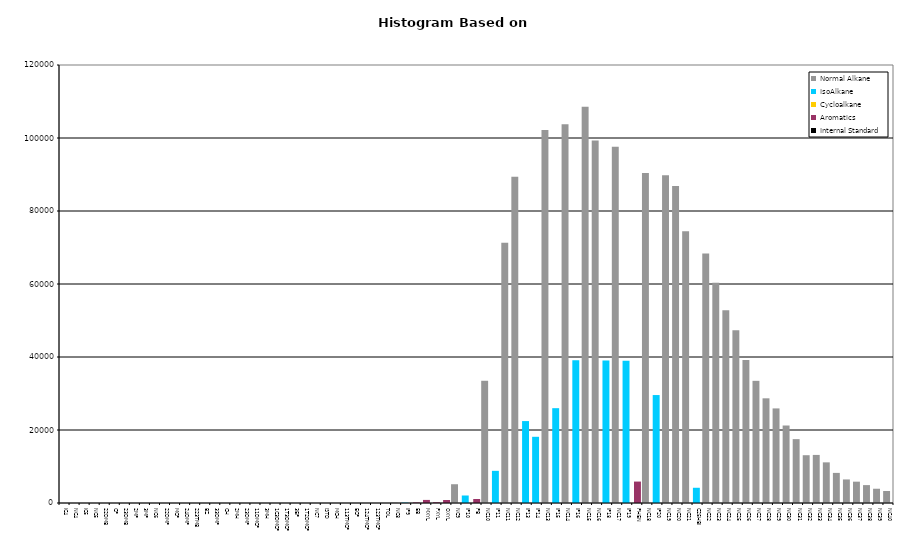
| Category | Normal Alkane | IsoAlkane | Cycloalkane | Aromatics | Internal Standard |
|---|---|---|---|---|---|
| IC4 | 0 | 0 | 0 | 0 | 0 |
| NC4 | 0 | 0 | 0 | 0 | 0 |
| IC5 | 0 | 0 | 0 | 0 | 0 |
| NC5 | 0 | 0 | 0 | 0 | 0 |
| 22DMB | 0 | 0 | 0 | 0 | 0 |
| CP | 0 | 0 | 0 | 0 | 0 |
| 23DMB | 0 | 0 | 0 | 0 | 0 |
| 2MP | 0 | 0 | 0 | 0 | 0 |
| 3MP | 0 | 0 | 0 | 0 | 0 |
| NC6 | 0 | 0 | 0 | 0 | 0 |
| 22DMP | 0 | 0 | 0 | 0 | 0 |
| MCP | 0 | 0 | 0 | 0 | 0 |
| 24DMP | 0 | 0 | 0 | 0 | 0 |
| 223TMB | 0 | 0 | 0 | 0 | 0 |
| BZ | 0 | 0 | 0 | 0 | 0 |
| 33DMP | 0 | 0 | 0 | 0 | 0 |
| CH | 0 | 0 | 0 | 0 | 0 |
| 2MH | 0 | 0 | 0 | 0 | 0 |
| 23DMP | 0 | 0 | 0 | 0 | 0 |
| 11DMCP | 0 | 0 | 0 | 0 | 0 |
| 3MH | 0 | 0 | 0 | 0 | 0 |
| 1C3DMCP | 0 | 0 | 0 | 0 | 0 |
| 1T3DMCP | 0 | 0 | 0 | 0 | 0 |
| 3EP | 0 | 0 | 0 | 0 | 0 |
| 1T2DMCP | 0 | 0 | 0 | 0 | 0 |
| NC7 | 0 | 0 | 0 | 0 | 0 |
| ISTD | 0 | 0 | 0 | 0 | 0 |
| MCH | 0 | 0 | 0 | 0 | 0 |
| 113TMCP | 0 | 0 | 0 | 0 | 0 |
| ECP | 0 | 0 | 0 | 0 | 0 |
| 124TMCP | 0 | 0 | 0 | 0 | 0 |
| 123TMCP | 0 | 0 | 0 | 0 | 0 |
| TOL | 0 | 0 | 0 | 0 | 0 |
| NC8 | 88 | 0 | 0 | 0 | 0 |
| IP9 | 0 | 107 | 0 | 0 | 0 |
| EB | 0 | 0 | 0 | 159 | 0 |
| MXYL | 0 | 0 | 0 | 844 | 0 |
| PXYL | 0 | 0 | 0 | 206 | 0 |
| OXYL | 0 | 0 | 0 | 819 | 0 |
| NC9 | 5143 | 0 | 0 | 0 | 0 |
| IP10 | 0 | 2055 | 0 | 0 | 0 |
| PB | 0 | 0 | 0 | 1101 | 0 |
| NC10 | 33487 | 0 | 0 | 0 | 0 |
| IP11 | 0 | 8812 | 0 | 0 | 0 |
| NC11 | 71302 | 0 | 0 | 0 | 0 |
| NC12 | 89387 | 0 | 0 | 0 | 0 |
| IP13 | 0 | 22445 | 0 | 0 | 0 |
| IP14 | 0 | 18138 | 0 | 0 | 0 |
| NC13 | 102183 | 0 | 0 | 0 | 0 |
| IP15 | 0 | 25978 | 0 | 0 | 0 |
| NC14 | 103780 | 0 | 0 | 0 | 0 |
| IP16 | 0 | 39123 | 0 | 0 | 0 |
| NC15 | 108555 | 0 | 0 | 0 | 0 |
| NC16 | 99295 | 0 | 0 | 0 | 0 |
| IP18 | 0 | 39028 | 0 | 0 | 0 |
| NC17 | 97632 | 0 | 0 | 0 | 0 |
| IP19 | 0 | 38961 | 0 | 0 | 0 |
| PHEN | 0 | 0 | 0 | 5872 | 0 |
| NC18 | 90402 | 0 | 0 | 0 | 0 |
| IP20 | 0 | 29577 | 0 | 0 | 0 |
| NC19 | 89818 | 0 | 0 | 0 | 0 |
| NC20 | 86842 | 0 | 0 | 0 | 0 |
| NC21 | 74425 | 0 | 0 | 0 | 0 |
| C25HBI | 0 | 4174 | 0 | 0 | 0 |
| NC22 | 68367 | 0 | 0 | 0 | 0 |
| NC23 | 60375 | 0 | 0 | 0 | 0 |
| NC24 | 52824 | 0 | 0 | 0 | 0 |
| NC25 | 47323 | 0 | 0 | 0 | 0 |
| NC26 | 39161 | 0 | 0 | 0 | 0 |
| NC27 | 33471 | 0 | 0 | 0 | 0 |
| NC28 | 28681 | 0 | 0 | 0 | 0 |
| NC29 | 25916 | 0 | 0 | 0 | 0 |
| NC30 | 21232 | 0 | 0 | 0 | 0 |
| NC31 | 17494 | 0 | 0 | 0 | 0 |
| NC32 | 13092 | 0 | 0 | 0 | 0 |
| NC33 | 13172 | 0 | 0 | 0 | 0 |
| NC34 | 11136 | 0 | 0 | 0 | 0 |
| NC35 | 8247 | 0 | 0 | 0 | 0 |
| NC36 | 6451 | 0 | 0 | 0 | 0 |
| NC37 | 5844 | 0 | 0 | 0 | 0 |
| NC38 | 4902 | 0 | 0 | 0 | 0 |
| NC39 | 3908 | 0 | 0 | 0 | 0 |
| NC40 | 3281 | 0 | 0 | 0 | 0 |